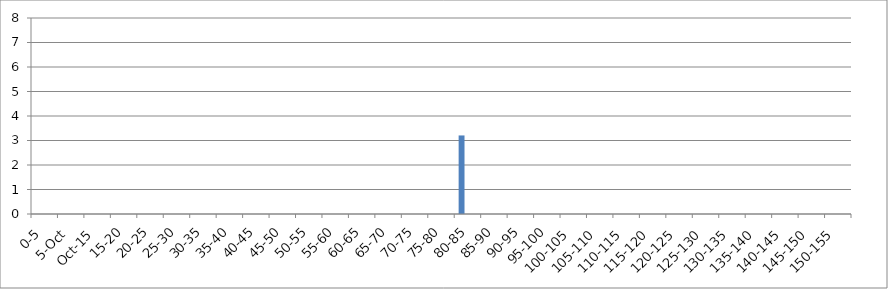
| Category | 119875 | 146067 | 241240 |
|---|---|---|---|
| 0-5 | 0 | 0 | 0 |
| 5-Oct | 0 | 0 | 0 |
| Oct-15 | 0 | 0 | 0 |
| 15-20 | 0 | 0 | 0 |
| 20-25 | 0 | 0 | 0 |
| 25-30 | 0 | 0 | 0 |
| 30-35 | 0 | 0 | 0 |
| 35-40 | 0 | 0 | 0 |
| 40-45 | 0 | 0 | 0 |
| 45-50 | 0 | 0 | 0 |
| 50-55 | 0 | 0 | 0 |
| 55-60 | 0 | 0 | 0 |
| 60-65 | 0 | 0 | 0 |
| 65-70 | 0 | 0 | 0 |
| 70-75 | 0 | 0 | 0 |
| 75-80 | 0 | 0 | 0 |
| 80-85 | 3.206 | 0 | 0 |
| 85-90 | 0 | 0 | 0 |
| 90-95 | 0 | 0 | 0 |
| 95-100 | 0 | 0 | 0 |
| 100-105 | 0 | 0 | 0 |
| 105-110 | 0 | 0 | 0 |
| 110-115 | 0 | 0 | 0 |
| 115-120 | 0 | 0 | 0 |
| 120-125 | 0 | 0 | 0 |
| 125-130 | 0 | 0 | 0 |
| 130-135 | 0 | 0 | 0 |
| 135-140 | 0 | 0 | 0 |
| 140-145 | 0 | 0 | 0 |
| 145-150 | 0 | 0 | 0 |
| 150-155 | 0 | 0 | 0 |